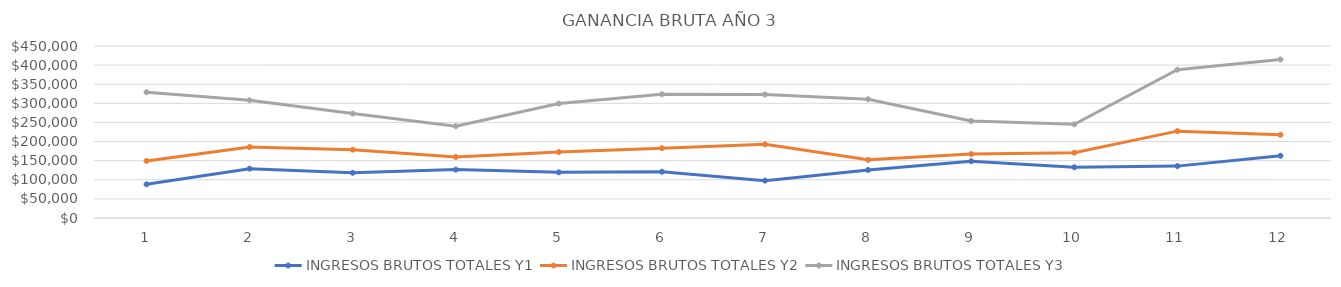
| Category | INGRESOS BRUTOS TOTALES Y1 | INGRESOS BRUTOS TOTALES Y2 | INGRESOS BRUTOS TOTALES Y3 |
|---|---|---|---|
| 0 | 88114 | 149299.8 | 328920.1 |
| 1 | 129087 | 185572.05 | 307938.2 |
| 2 | 118320 | 178734.75 | 273173.6 |
| 3 | 126600 | 159643.5 | 240058.1 |
| 4 | 119528 | 172671.8 | 299376.2 |
| 5 | 121091.5 | 182784.4 | 323907 |
| 6 | 97705.5 | 192648.75 | 323256.1 |
| 7 | 125637 | 152163.2 | 310748.5 |
| 8 | 148434 | 167284.6 | 253671.3 |
| 9 | 132710 | 170910.05 | 245075.1 |
| 10 | 135723 | 227271.75 | 388017.1 |
| 11 | 162928 | 217656 | 414703.8 |